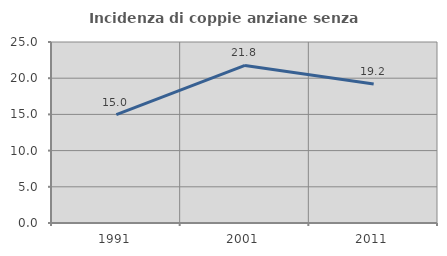
| Category | Incidenza di coppie anziane senza figli  |
|---|---|
| 1991.0 | 14.97 |
| 2001.0 | 21.765 |
| 2011.0 | 19.186 |